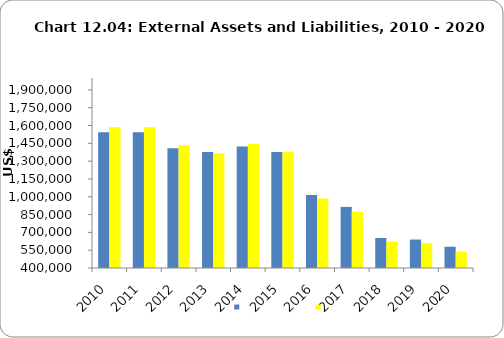
| Category | Series 0 | Series 1 |
|---|---|---|
| 2010.0 | 1543735 | 1584592 |
| 2011.0 | 1543735 | 1584592 |
| 2012.0 | 1409321 | 1434218 |
| 2013.0 | 1377200 | 1366800 |
| 2014.0 | 1423029 | 1443356 |
| 2015.0 | 1377000 | 1380000 |
| 2016.0 | 1015623 | 985470 |
| 2017.0 | 914692 | 874427 |
| 2018.0 | 652463 | 622186 |
| 2019.0 | 639524 | 609685 |
| 2020.0 | 578970 | 537752 |